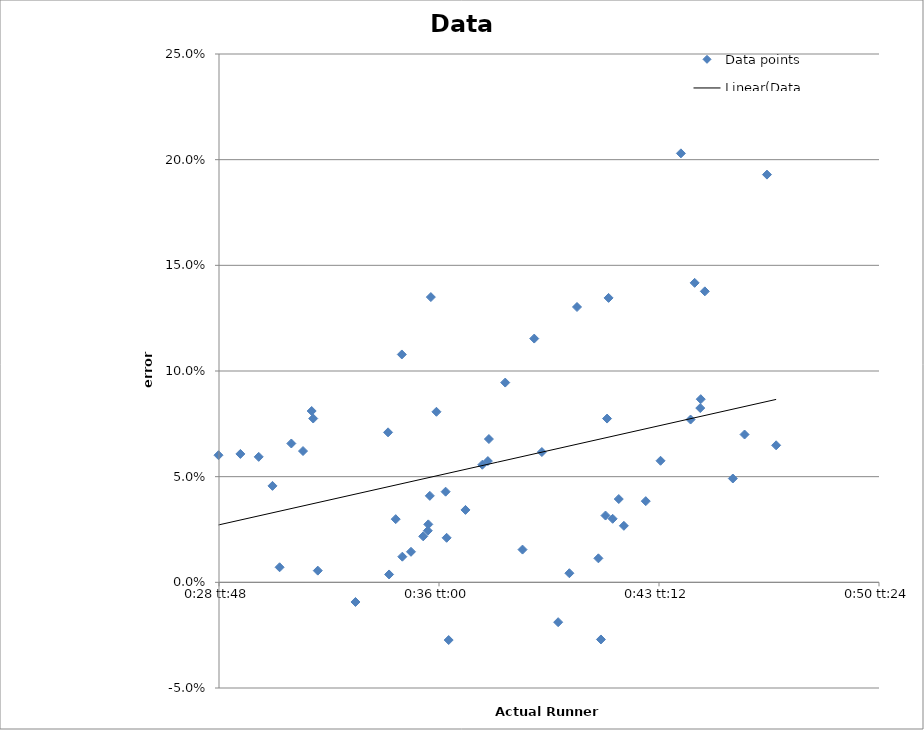
| Category | Data points |
|---|---|
| 0.019988425925925927 | 0.06 |
| 0.02048611111111111 | 0.061 |
| 0.02090277777777778 | 0.059 |
| 0.021215277777777777 | 0.046 |
| 0.021377314814814818 | 0.007 |
| 0.02164351851851852 | 0.066 |
| 0.021909722222222223 | 0.062 |
| 0.02210648148148148 | 0.081 |
| 0.022141203703703705 | 0.078 |
| 0.02224537037037037 | 0.006 |
| 0.02310185185185185 | -0.009 |
| 0.023842592592592596 | 0.071 |
| 0.023865740740740743 | 0.004 |
| 0.024016203703703706 | 0.03 |
| 0.02415509259259259 | 0.108 |
| 0.024166666666666666 | 0.012 |
| 0.024363425925925927 | 0.014 |
| 0.024641203703703703 | 0.022 |
| 0.024745370370370372 | 0.024 |
| 0.024756944444444443 | 0.027 |
| 0.02479166666666667 | 0.041 |
| 0.024814814814814817 | 0.135 |
| 0.02494212962962963 | 0.081 |
| 0.02515046296296296 | 0.043 |
| 0.02517361111111111 | 0.021 |
| 0.02521990740740741 | -0.027 |
| 0.02560185185185185 | 0.034 |
| 0.025983796296296297 | 0.056 |
| 0.026111111111111113 | 0.057 |
| 0.02613425925925926 | 0.068 |
| 0.026504629629629628 | 0.095 |
| 0.026898148148148147 | 0.015 |
| 0.027164351851851853 | 0.115 |
| 0.027337962962962963 | 0.062 |
| 0.02770833333333333 | -0.019 |
| 0.027962962962962964 | 0.004 |
| 0.028136574074074074 | 0.13 |
| 0.028622685185185185 | 0.011 |
| 0.028680555555555553 | -0.027 |
| 0.028784722222222225 | 0.032 |
| 0.028819444444444443 | 0.077 |
| 0.028854166666666667 | 0.135 |
| 0.028946759259259255 | 0.03 |
| 0.02908564814814815 | 0.039 |
| 0.029201388888888888 | 0.027 |
| 0.029699074074074072 | 0.038 |
| 0.030034722222222223 | 0.058 |
| 0.030497685185185183 | 0.203 |
| 0.03071759259259259 | 0.077 |
| 0.030810185185185187 | 0.142 |
| 0.030937499999999996 | 0.082 |
| 0.030949074074074077 | 0.087 |
| 0.031041666666666665 | 0.138 |
| 0.03167824074074074 | 0.049 |
| 0.03194444444444445 | 0.07 |
| 0.0324537037037037 | 0.193 |
| 0.03266203703703704 | 0.065 |